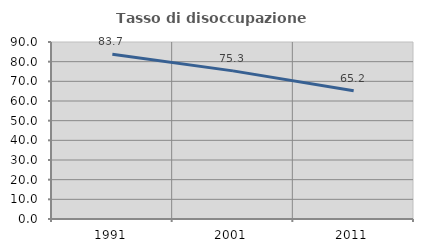
| Category | Tasso di disoccupazione giovanile  |
|---|---|
| 1991.0 | 83.726 |
| 2001.0 | 75.316 |
| 2011.0 | 65.179 |